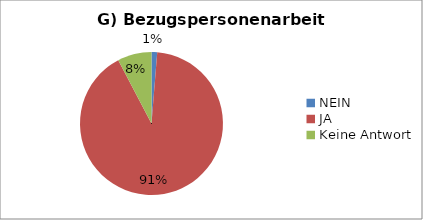
| Category | Series 0 |
|---|---|
| NEIN | 1 |
| JA | 71 |
| Keine Antwort | 6 |